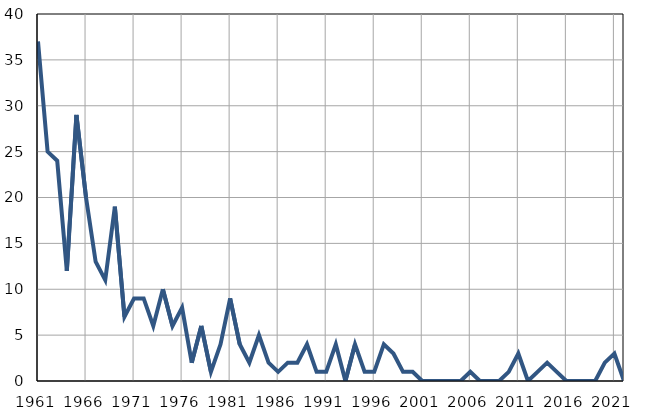
| Category | Infants
deaths |
|---|---|
| 1961.0 | 37 |
| 1962.0 | 25 |
| 1963.0 | 24 |
| 1964.0 | 12 |
| 1965.0 | 29 |
| 1966.0 | 20 |
| 1967.0 | 13 |
| 1968.0 | 11 |
| 1969.0 | 19 |
| 1970.0 | 7 |
| 1971.0 | 9 |
| 1972.0 | 9 |
| 1973.0 | 6 |
| 1974.0 | 10 |
| 1975.0 | 6 |
| 1976.0 | 8 |
| 1977.0 | 2 |
| 1978.0 | 6 |
| 1979.0 | 1 |
| 1980.0 | 4 |
| 1981.0 | 9 |
| 1982.0 | 4 |
| 1983.0 | 2 |
| 1984.0 | 5 |
| 1985.0 | 2 |
| 1986.0 | 1 |
| 1987.0 | 2 |
| 1988.0 | 2 |
| 1989.0 | 4 |
| 1990.0 | 1 |
| 1991.0 | 1 |
| 1992.0 | 4 |
| 1993.0 | 0 |
| 1994.0 | 4 |
| 1995.0 | 1 |
| 1996.0 | 1 |
| 1997.0 | 4 |
| 1998.0 | 3 |
| 1999.0 | 1 |
| 2000.0 | 1 |
| 2001.0 | 0 |
| 2002.0 | 0 |
| 2003.0 | 0 |
| 2004.0 | 0 |
| 2005.0 | 0 |
| 2006.0 | 1 |
| 2007.0 | 0 |
| 2008.0 | 0 |
| 2009.0 | 0 |
| 2010.0 | 1 |
| 2011.0 | 3 |
| 2012.0 | 0 |
| 2013.0 | 1 |
| 2014.0 | 2 |
| 2015.0 | 1 |
| 2016.0 | 0 |
| 2017.0 | 0 |
| 2018.0 | 0 |
| 2019.0 | 0 |
| 2020.0 | 2 |
| 2021.0 | 3 |
| 2022.0 | 0 |